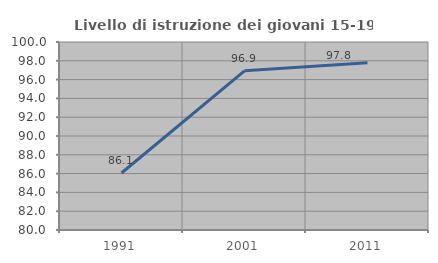
| Category | Livello di istruzione dei giovani 15-19 anni |
|---|---|
| 1991.0 | 86.066 |
| 2001.0 | 96.933 |
| 2011.0 | 97.793 |